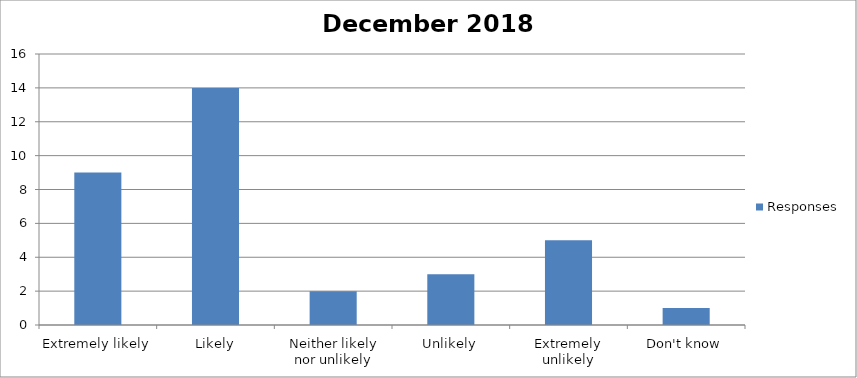
| Category | Responses |
|---|---|
| Extremely likely | 9 |
| Likely | 14 |
| Neither likely nor unlikely | 2 |
| Unlikely | 3 |
| Extremely unlikely | 5 |
| Don't know | 1 |